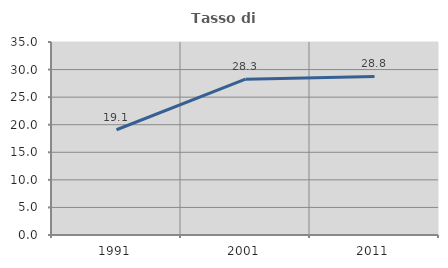
| Category | Tasso di occupazione   |
|---|---|
| 1991.0 | 19.088 |
| 2001.0 | 28.261 |
| 2011.0 | 28.761 |